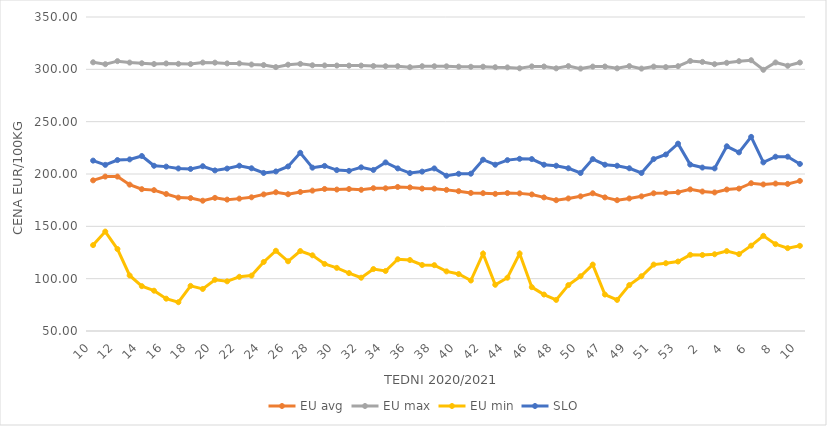
| Category | EU avg | EU max | EU min | SLO |
|---|---|---|---|---|
| 10.0 | 193.933 | 306.73 | 132.064 | 212.78 |
| 11.0 | 197.552 | 304.92 | 145.006 | 208.73 |
| 12.0 | 197.533 | 307.82 | 128.293 | 213.32 |
| 13.0 | 189.839 | 306.44 | 103.04 | 213.96 |
| 14.0 | 185.504 | 305.8 | 92.836 | 217.19 |
| 15.0 | 184.591 | 305.08 | 88.508 | 207.87 |
| 16.0 | 180.892 | 305.63 | 80.873 | 207.05 |
| 17.0 | 177.437 | 305.27 | 77.506 | 205.29 |
| 18.0 | 176.995 | 305.01 | 93.104 | 204.82 |
| 19.0 | 174.49 | 306.49 | 90.169 | 207.44 |
| 20.0 | 177.204 | 306.38 | 98.928 | 203.41 |
| 21.0 | 175.519 | 305.66 | 97.454 | 205.19 |
| 22.0 | 176.473 | 305.64 | 101.792 | 207.91 |
| 23.0 | 177.741 | 304.59 | 102.918 | 205.46 |
| 24.0 | 180.501 | 304.1 | 115.936 | 201 |
| 25.0 | 182.568 | 302.13 | 126.655 | 202.43 |
| 26.0 | 180.667 | 304.43 | 116.597 | 207.19 |
| 27.0 | 182.833 | 305.22 | 126.397 | 220.25 |
| 28.0 | 184.121 | 303.88 | 122.317 | 206.06 |
| 29.0 | 185.712 | 303.73 | 114.082 | 207.73 |
| 30.0 | 185.141 | 303.63 | 110.314 | 203.73 |
| 31.0 | 185.621 | 303.57 | 105.336 | 203 |
| 32.0 | 184.887 | 303.58 | 100.908 | 206.36 |
| 33.0 | 186.411 | 303.17 | 109.191 | 203.88 |
| 34.0 | 186.338 | 302.96 | 107.355 | 211.07 |
| 35.0 | 187.628 | 302.99 | 118.534 | 205.34 |
| 36.0 | 187.19 | 302.05 | 117.814 | 200.88 |
| 37.0 | 186.038 | 302.98 | 113.058 | 202.29 |
| 38.0 | 185.986 | 302.94 | 112.896 | 205.33 |
| 39.0 | 184.836 | 302.88 | 106.953 | 198.33 |
| 40.0 | 183.595 | 302.56 | 104.426 | 200.21 |
| 41.0 | 181.893 | 302.44 | 98.23 | 200.3 |
| 42.0 | 181.671 | 302.52 | 123.908 | 213.66 |
| 43.0 | 181.023 | 302.01 | 94.177 | 208.86 |
| 44.0 | 181.795 | 301.86 | 100.908 | 213.25 |
| 45.0 | 181.489 | 300.98 | 124 | 214.51 |
| 46.0 | 180.473 | 302.82 | 91.889 | 214.27 |
| 47.0 | 177.656 | 302.7 | 84.832 | 208.87 |
| 48.0 | 174.977 | 300.94 | 79.697 | 207.9 |
| 49.0 | 176.65 | 303.09 | 93.873 | 205.48 |
| 50.0 | 178.648 | 300.7 | 102.316 | 200.99 |
| 51.0 | 181.58 | 302.62 | 113.46 | 214.25 |
| 47.0 | 177.656 | 302.7 | 84.832 | 208.87 |
| 48.0 | 174.977 | 300.94 | 79.697 | 207.9 |
| 49.0 | 176.65 | 303.09 | 93.873 | 205.48 |
| 50.0 | 178.648 | 300.7 | 102.316 | 200.99 |
| 51.0 | 181.58 | 302.62 | 113.46 | 214.25 |
| 52.0 | 181.9 | 302.14 | 114.76 | 218.61 |
| 53.0 | 182.536 | 303 | 116.375 | 229 |
| 1.0 | 185.3 | 308 | 122.769 | 209 |
| 2.0 | 183.25 | 307.1 | 122.609 | 206.15 |
| 3.0 | 182.393 | 304.91 | 123.32 | 205.35 |
| 4.0 | 185.158 | 306.22 | 126.329 | 226.48 |
| 5.0 | 186.04 | 307.79 | 123.461 | 220.65 |
| 6.0 | 191.206 | 308.7 | 131.528 | 235.46 |
| 7.0 | 190.028 | 299.55 | 140.902 | 211.1 |
| 8.0 | 190.875 | 306.55 | 132.97 | 216.51 |
| 9.0 | 190.519 | 303.4 | 129.173 | 216.54 |
| 10.0 | 193.416 | 306.48 | 131.374 | 209.61 |